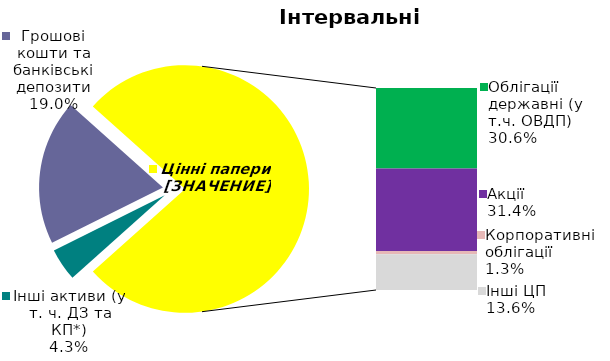
| Category | Series 0 |
|---|---|
| Інші активи (у т. ч. ДЗ та КП*) | 0.043 |
| Грошові кошти та банківські депозити | 0.19 |
| Банківські метали | 0 |
| Облігації державні (у т.ч. ОВДП) | 0.306 |
| Облігації місцевих позик | 0 |
| Акції | 0.314 |
| Корпоративні облігації | 0.013 |
| Інші ЦП | 0.136 |